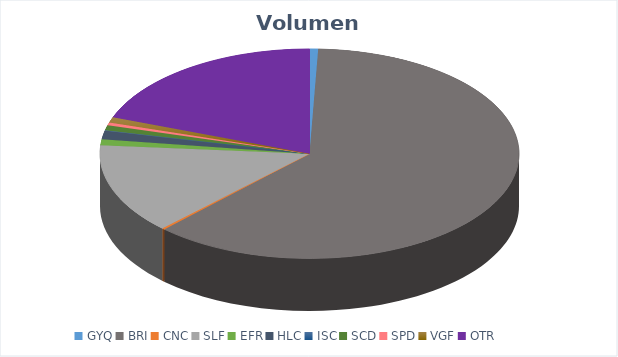
| Category | VOLUMEN ($USD) |
|---|---|
| GYQ | 10271.82 |
| BRI | 950000 |
| CNC | 3430 |
| SLF | 215139.16 |
| EFR | 14281.8 |
| HLC | 20440 |
| ISC | 1050 |
| SCD | 11624.4 |
| SPD | 6957.5 |
| VGF | 13002.6 |
| OTR | 298987.5 |